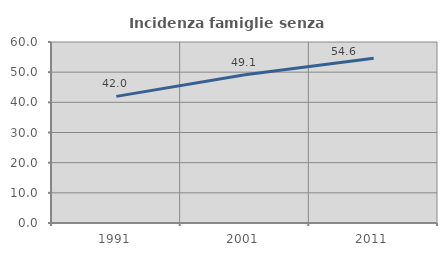
| Category | Incidenza famiglie senza nuclei |
|---|---|
| 1991.0 | 41.977 |
| 2001.0 | 49.116 |
| 2011.0 | 54.605 |